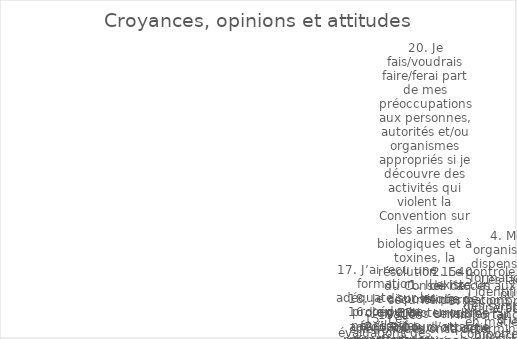
| Category | Series 0 |
|---|---|
| 1. Il existe un risque de bioterrorisme ou d’attaque avec une arme biologique. | 3 |
| 2. Le contrôle de l’accès aux informations sensibles fait partie intégrante de la biosûreté. | 4 |
| 3. Je comprends l’importance de la détermination de la fidélité. | 1 |
| 4. Mon organisation dispense une formation sur l’identification des symptômes d’un comportement à haut risque chez soi et chez les autres. | 0 |
| 5. Les lacunes ou vulnérabilités en matière de biosécurité et/ou de biosûreté sont corrigées avec un sentiment d’urgence. | 2 |
| 6. Je suis fier de mon travail. | 4 |
| 7. Mon organisation et ses membres encouragent le travail d’équipe et la coopération. | 5 |
| 8. Les infractions en matière de biosécurité et de biosûreté sont traitées de manière appropriée. | 2 |
| 9. Mon organisation se soucie plus de la biosécurité que des résultats de notre travail. | 1 |
| 10. Je suis conscient qu’il y a des problèmes et des conséquences éthiques, juridiques et sociétaux liés à mes recherches. | 0 |
| 11. L’expertise technique et l’expérience soutiennent l’assurance des performances futures en matière de biosécurité. | 4 |
| 12. Dans mon organisation, les individus ont les compétences appropriées pour effectuer les tâches qui leur sont assignées et pour travailler de manière sécuritaire et efficace. | 2 |
| 13. Mon organisation a une culture qui soutient et encourage la confiance, la collaboration, la consultation et la communication en matière de biosécurité et de biosûreté. | 0 |
| 14. La politique et la législation nationales relatives aux sciences de la vie visent à assurer une protection contre le mésusage de la science.6 | 2 |
| 15. Les évaluations des risques sont des outils importants pour identifier les domaines à améliorer et des mesures spécifiques pour réduire les risques, y compris le niveau de confinement requis. | 0 |
| 16. Je pense qu’il est important de signaler non seulement les accidents et incidents de laboratoire, mais aussi les quasi-accidents. | 2 |
| 17. J’ai reçu une formation adéquate sur les procédures nécessaires pour effectuer mon travail sans compromettre la sécurité et la sûreté. | 5 |
| 18. Je dispose d’un EPI adéquat pour effectuer mon travail en toute sécurité. | 5 |
| 19. Les scientifiques ont l’obligation de ne pas nuire . | 3 |
| 20. Je fais/voudrais faire/ferai part de mes préoccupations aux personnes, autorités et/ou organismes appropriés si je découvre des activités qui violent la Convention sur les armes biologiques et à toxines, la résolution 1540 du Conseil de sécurité des N | 2 |